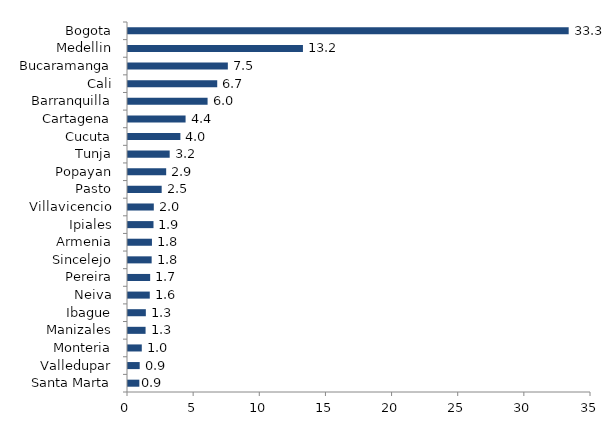
| Category | Series 0 |
|---|---|
| Santa Marta | 0.856 |
| Valledupar | 0.884 |
| Monteria | 1.043 |
| Manizales | 1.329 |
| Ibague | 1.349 |
| Neiva | 1.646 |
| Pereira | 1.675 |
| Sincelejo | 1.788 |
| Armenia | 1.81 |
| Ipiales | 1.927 |
| Villavicencio | 1.951 |
| Pasto | 2.546 |
| Popayan | 2.886 |
| Tunja | 3.151 |
| Cucuta | 3.96 |
| Cartagena | 4.353 |
| Barranquilla | 6.016 |
| Cali | 6.745 |
| Bucaramanga | 7.547 |
| Medellin | 13.225 |
| Bogota | 33.313 |